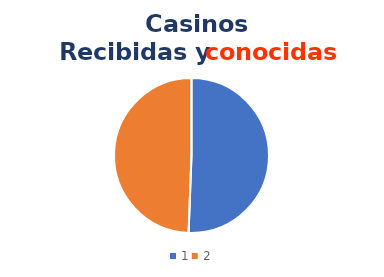
| Category | Series 0 |
|---|---|
| 0 | 42 |
| 1 | 41 |